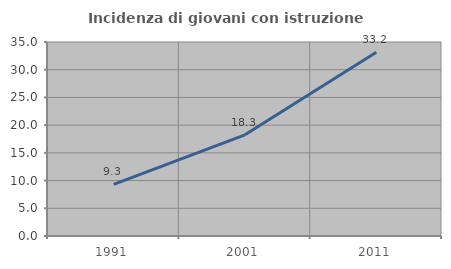
| Category | Incidenza di giovani con istruzione universitaria |
|---|---|
| 1991.0 | 9.307 |
| 2001.0 | 18.259 |
| 2011.0 | 33.161 |